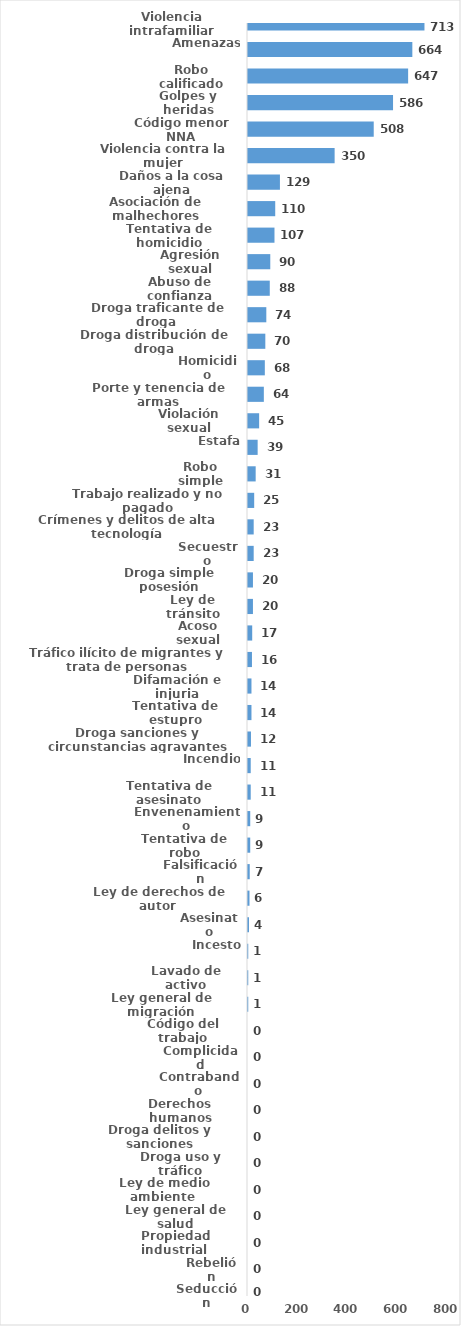
| Category | Series 0 |
|---|---|
| Violencia intrafamiliar | 713 |
| Amenazas | 664 |
| Robo calificado | 647 |
| Golpes y heridas | 586 |
| Código menor NNA | 508 |
| Violencia contra la mujer | 350 |
| Daños a la cosa ajena | 129 |
| Asociación de malhechores | 110 |
| Tentativa de homicidio | 107 |
| Agresión sexual | 90 |
| Abuso de confianza | 88 |
| Droga traficante de droga  | 74 |
| Droga distribución de droga | 70 |
| Homicidio | 68 |
| Porte y tenencia de armas | 64 |
| Violación sexual | 45 |
| Estafa | 39 |
| Robo simple | 31 |
| Trabajo realizado y no pagado | 25 |
| Crímenes y delitos de alta tecnología | 23 |
| Secuestro | 23 |
| Droga simple posesión | 20 |
| Ley de tránsito | 20 |
| Acoso sexual | 17 |
| Tráfico ilícito de migrantes y trata de personas | 16 |
| Difamación e injuria | 14 |
| Tentativa de estupro | 14 |
| Droga sanciones y circunstancias agravantes | 12 |
| Incendio | 11 |
| Tentativa de asesinato | 11 |
| Envenenamiento | 9 |
| Tentativa de robo | 9 |
| Falsificación | 7 |
| Ley de derechos de autor  | 6 |
| Asesinato | 4 |
| Incesto | 1 |
| Lavado de activo | 1 |
| Ley general de migración | 1 |
| Código del trabajo | 0 |
| Complicidad | 0 |
| Contrabando | 0 |
| Derechos humanos | 0 |
| Droga delitos y sanciones | 0 |
| Droga uso y tráfico | 0 |
| Ley de medio ambiente  | 0 |
| Ley general de salud | 0 |
| Propiedad industrial  | 0 |
| Rebelión | 0 |
| Seducción | 0 |